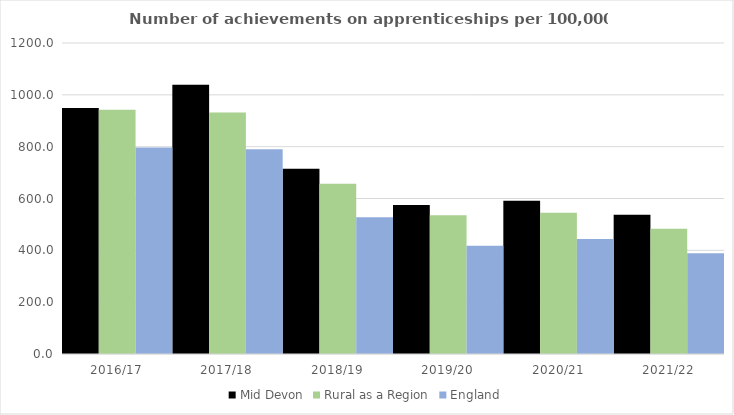
| Category | Mid Devon | Rural as a Region | England |
|---|---|---|---|
| 2016/17 | 949 | 942.594 | 797 |
| 2017/18 | 1039 | 931.709 | 790 |
| 2018/19 | 715 | 656.44 | 528 |
| 2019/20 | 575 | 535.552 | 418 |
| 2020/21 | 591 | 545.333 | 444 |
| 2021/22 | 537 | 482.936 | 389 |